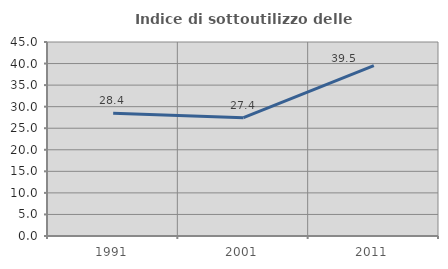
| Category | Indice di sottoutilizzo delle abitazioni  |
|---|---|
| 1991.0 | 28.449 |
| 2001.0 | 27.44 |
| 2011.0 | 39.537 |